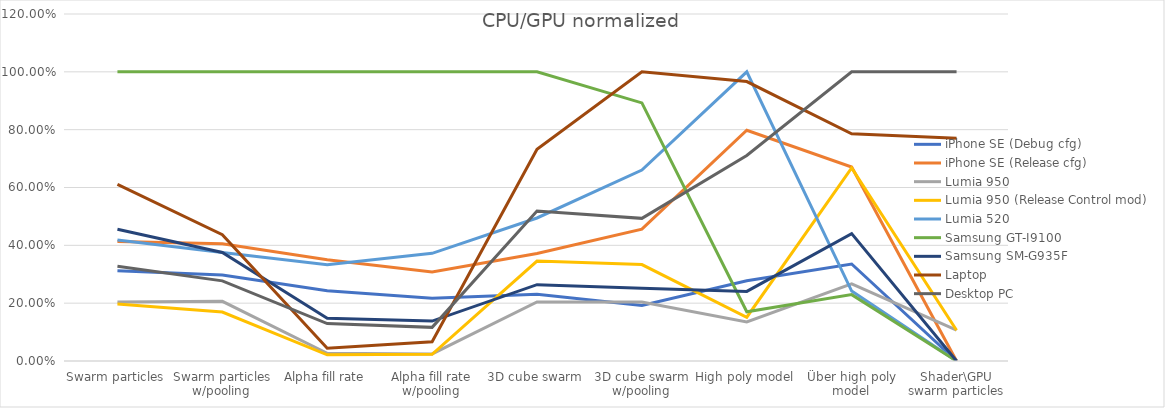
| Category | iPhone SE (Debug cfg) | iPhone SE (Release cfg) | Lumia 950 | Lumia 950 (Release Control mod) | Lumia 520 | Samsung GT-I9100 | Samsung SM-G935F | Laptop | Desktop PC |
|---|---|---|---|---|---|---|---|---|---|
| Swarm particles | 0.312 | 0.413 | 0.204 | 0.197 | 0.419 | 1 | 0.456 | 0.611 | 0.328 |
| Swarm particles w/pooling | 0.297 | 0.405 | 0.206 | 0.169 | 0.375 | 1 | 0.375 | 0.437 | 0.277 |
| Alpha fill rate | 0.243 | 0.35 | 0.026 | 0.021 | 0.332 | 1 | 0.148 | 0.044 | 0.129 |
| Alpha fill rate w/pooling | 0.217 | 0.308 | 0.024 | 0.023 | 0.372 | 1 | 0.138 | 0.067 | 0.116 |
| 3D cube swarm | 0.231 | 0.372 | 0.204 | 0.346 | 0.495 | 1 | 0.264 | 0.733 | 0.519 |
| 3D cube swarm w/pooling | 0.192 | 0.456 | 0.204 | 0.333 | 0.66 | 0.893 | 0.251 | 1 | 0.493 |
| High poly model | 0.278 | 0.798 | 0.135 | 0.151 | 1 | 0.17 | 0.241 | 0.966 | 0.711 |
| Über high poly model | 0.335 | 0.671 | 0.267 | 0.668 | 0.242 | 0.229 | 0.44 | 0.786 | 1 |
| Shader\GPU swarm particles | 0 | 0 | 0.106 | 0.106 | 0 | 0 | 0 | 0.771 | 1 |